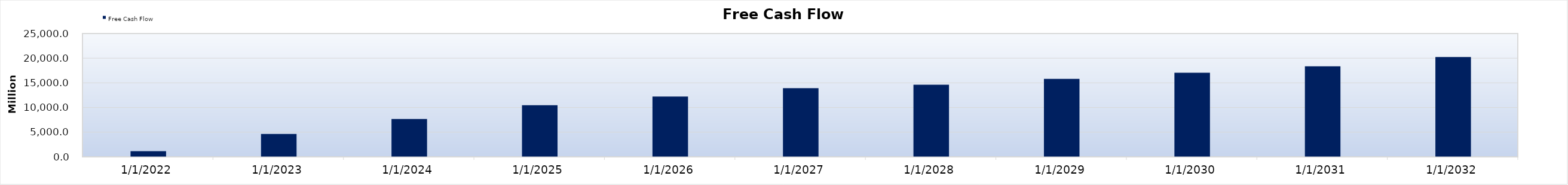
| Category | Series 1 | Series 2 | Free Cash Flow  | Series 4 |
|---|---|---|---|---|
| 10/2/22 |  |  | 1155.372 |  |
| 10/2/23 |  |  | 4642.698 |  |
| 10/1/24 |  |  | 7684.636 |  |
| 10/1/25 |  |  | 10467.245 |  |
| 10/2/26 |  |  | 12239.619 |  |
| 10/2/27 |  |  | 13922.79 |  |
| 10/1/28 |  |  | 14638.239 |  |
| 10/1/29 |  |  | 15813.749 |  |
| 10/2/30 |  |  | 17050.535 |  |
| 10/2/31 |  |  | 18363.812 |  |
| 10/1/32 |  |  | 20240.598 |  |